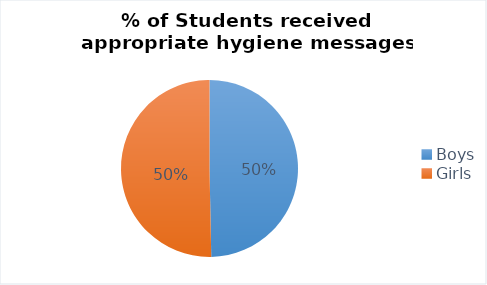
| Category | Total |
|---|---|
| Boys | 3627 |
| Girls | 3673 |